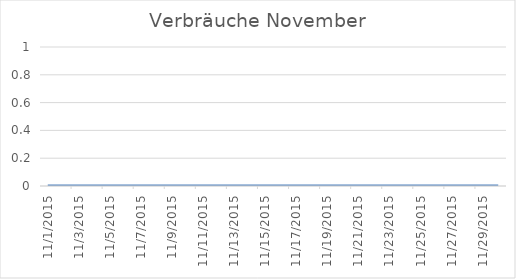
| Category | Series 0 |
|---|---|
| 01/11/2015 | 0 |
| 02/11/2015 | 0 |
| 03/11/2015 | 0 |
| 04/11/2015 | 0 |
| 05/11/2015 | 0 |
| 06/11/2015 | 0 |
| 07/11/2015 | 0 |
| 08/11/2015 | 0 |
| 09/11/2015 | 0 |
| 10/11/2015 | 0 |
| 11/11/2015 | 0 |
| 12/11/2015 | 0 |
| 13/11/2015 | 0 |
| 14/11/2015 | 0 |
| 15/11/2015 | 0 |
| 16/11/2015 | 0 |
| 17/11/2015 | 0 |
| 18/11/2015 | 0 |
| 19/11/2015 | 0 |
| 20/11/2015 | 0 |
| 21/11/2015 | 0 |
| 22/11/2015 | 0 |
| 23/11/2015 | 0 |
| 24/11/2015 | 0 |
| 25/11/2015 | 0 |
| 26/11/2015 | 0 |
| 27/11/2015 | 0 |
| 28/11/2015 | 0 |
| 29/11/2015 | 0 |
| 30/11/2015 | 0 |